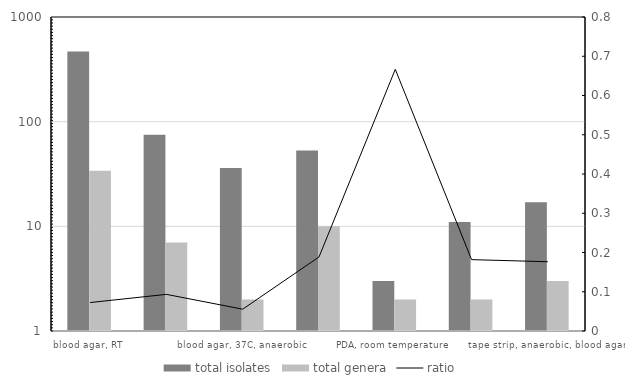
| Category | total isolates | total genera |
|---|---|---|
| blood agar, RT | 469 | 34 |
| blood agar, 37C | 75 | 7 |
| blood agar, 37C, anaerobic | 36 | 2 |
| R2A, room temperature | 53 | 10 |
| PDA, room temperature | 3 | 2 |
| MRS, room temperature | 11 | 2 |
| tape strip, anaerobic, blood agar | 17 | 3 |